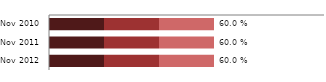
| Category | Severe (<7.0 g/dl) | Moderate (7.0-9.9 g/dl) | Mild (10.0-10.9 g/dl) | Total anaemia |
|---|---|---|---|---|
| 2010-11-01 | 0.2 | 0.2 | 0.2 | 0.6 |
| 2011-11-01 | 0.2 | 0.2 | 0.2 | 0.6 |
| 2012-11-01 | 0.2 | 0.2 | 0.2 | 0.6 |